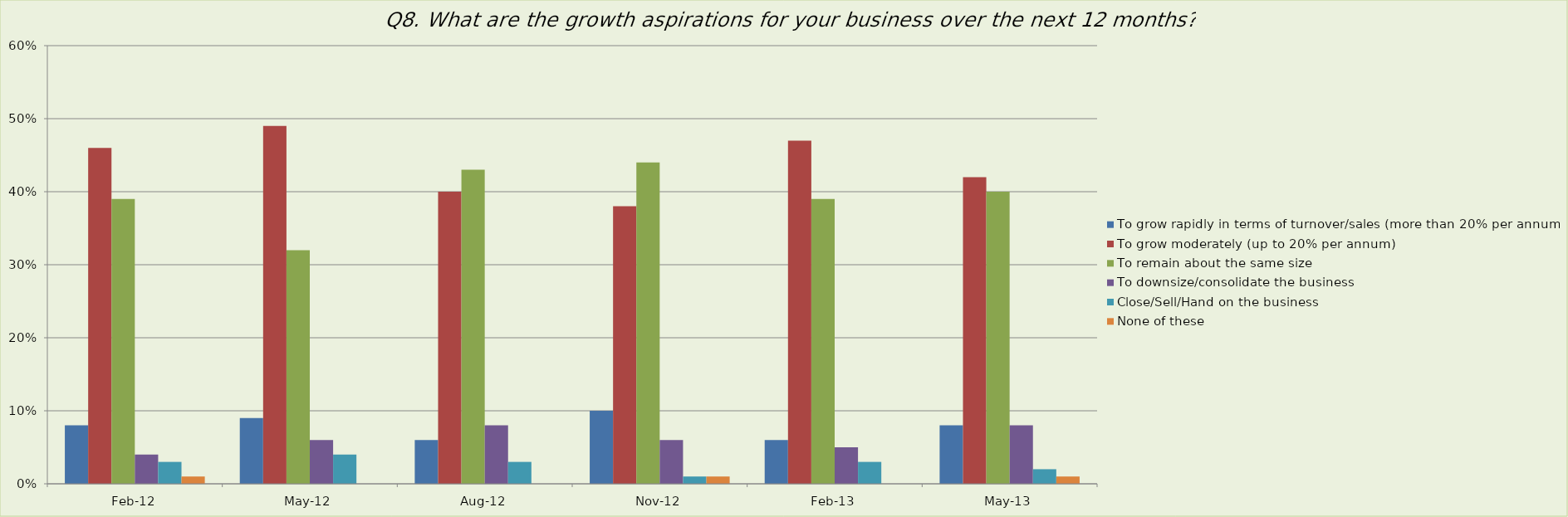
| Category | To grow rapidly in terms of turnover/sales (more than 20% per annum) | To grow moderately (up to 20% per annum) | To remain about the same size | To downsize/consolidate the business | Close/Sell/Hand on the business | None of these |
|---|---|---|---|---|---|---|
| 2012-02-01 | 0.08 | 0.46 | 0.39 | 0.04 | 0.03 | 0.01 |
| 2012-05-01 | 0.09 | 0.49 | 0.32 | 0.06 | 0.04 | 0 |
| 2012-08-01 | 0.06 | 0.4 | 0.43 | 0.08 | 0.03 | 0 |
| 2012-11-01 | 0.1 | 0.38 | 0.44 | 0.06 | 0.01 | 0.01 |
| 2013-02-01 | 0.06 | 0.47 | 0.39 | 0.05 | 0.03 | 0 |
| 2013-05-01 | 0.08 | 0.42 | 0.4 | 0.08 | 0.02 | 0.01 |